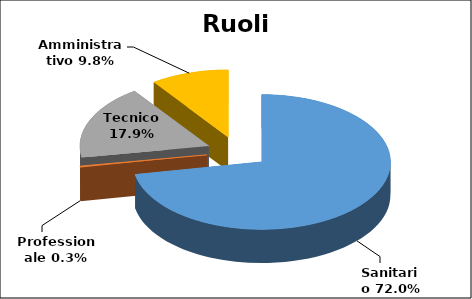
| Category | Series 0 |
|---|---|
| Sanitario | 0.72 |
| Professionale | 0.003 |
| Tecnico | 0.179 |
| Amministrativo | 0.098 |